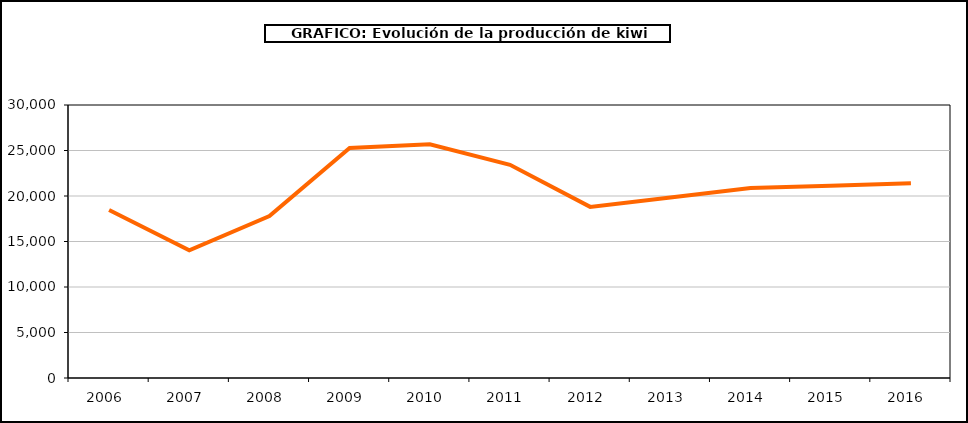
| Category | producción kiwi |
|---|---|
| 2006.0 | 18463 |
| 2007.0 | 14036 |
| 2008.0 | 17799 |
| 2009.0 | 25285 |
| 2010.0 | 25676 |
| 2011.0 | 23425 |
| 2012.0 | 18804 |
| 2013.0 | 19834 |
| 2014.0 | 20884 |
| 2015.0 | 21135 |
| 2016.0 | 21409 |